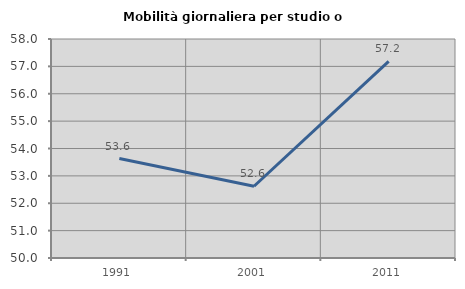
| Category | Mobilità giornaliera per studio o lavoro |
|---|---|
| 1991.0 | 53.632 |
| 2001.0 | 52.621 |
| 2011.0 | 57.186 |